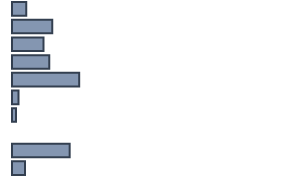
| Category | Series 0 |
|---|---|
| 0 | 5.2 |
| 1 | 14.8 |
| 2 | 11.6 |
| 3 | 13.7 |
| 4 | 24.7 |
| 5 | 2.4 |
| 6 | 1.5 |
| 7 | 0 |
| 8 | 21.2 |
| 9 | 4.8 |